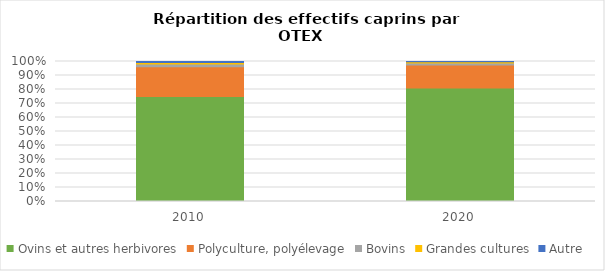
| Category | Ovins et autres herbivores | Polyculture, polyélevage | Bovins | Grandes cultures | Autre |
|---|---|---|---|---|---|
| 2010.0 | 74.95 | 21.234 | 1.994 | 1.148 | 0.674 |
| 2020.0 | 81.134 | 16.416 | 1.303 | 1.01 | 0.137 |